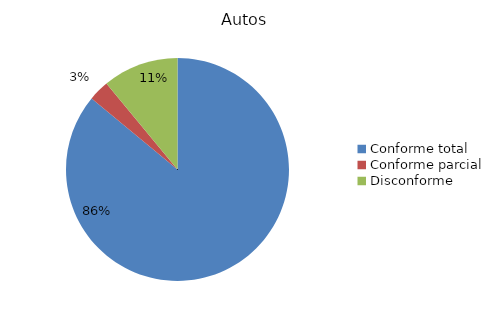
| Category | Autos |
|---|---|
| Conforme total | 86 |
| Conforme parcial | 3 |
| Disconforme | 11 |